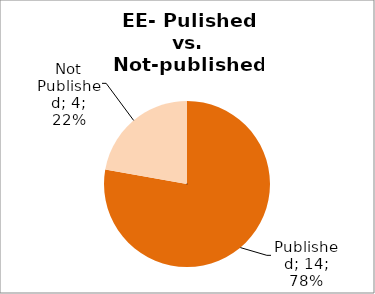
| Category | Series 0 |
|---|---|
| Published | 14 |
| Not Published | 4 |